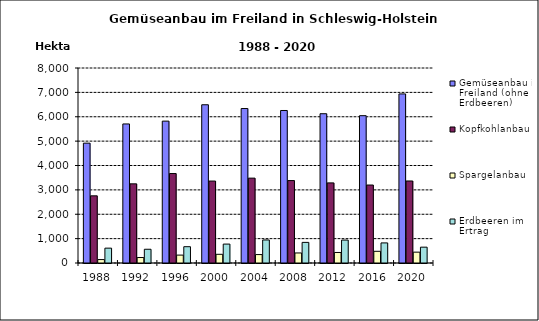
| Category | Gemüseanbau im Freiland (ohne Erdbeeren) | Kopfkohlanbau | Spargelanbau | Erdbeeren im Ertrag |
|---|---|---|---|---|
| 1988.0 | 4917 | 2756 | 141 | 609 |
| 1992.0 | 5705 | 3248 | 225 | 564 |
| 1996.0 | 5820 | 3670 | 324 | 669 |
| 2000.0 | 6492 | 3362 | 357 | 776 |
| 2004.0 | 6337 | 3482 | 346 | 945 |
| 2008.0 | 6257 | 3382 | 412 | 846 |
| 2012.0 | 6124 | 3286 | 432 | 941 |
| 2016.0 | 6044 | 3199 | 480 | 824 |
| 2020.0 | 6937 | 3365 | 445 | 650 |